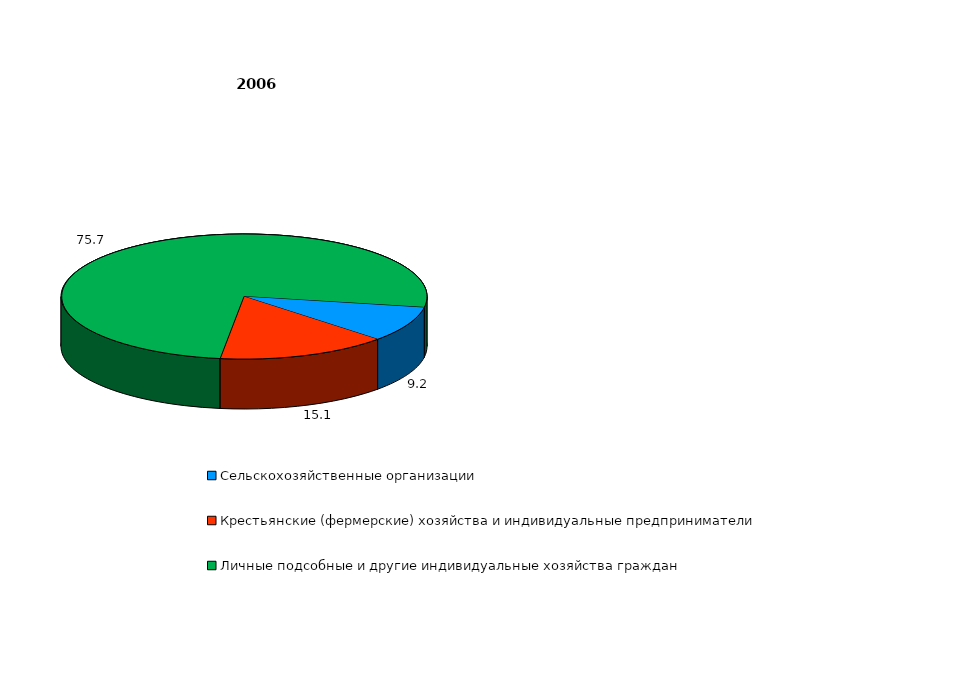
| Category | Series 0 |
|---|---|
| Сельскохозяйственные организации  | 9.2 |
| Крестьянские (фермерские) хозяйства и индивидуальные предприниматели  | 15.1 |
| Личные подсобные и другие индивидуальные хозяйства граждан  | 75.7 |